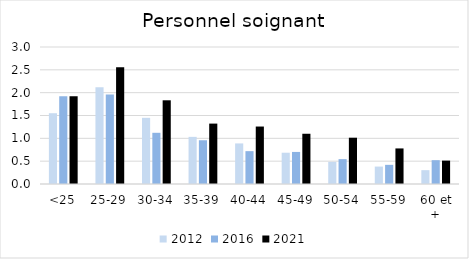
| Category | 2012 | 2016 | 2021 |
|---|---|---|---|
| <25 | 1.55 | 1.924 | 1.923 |
| 25-29 | 2.117 | 1.959 | 2.559 |
| 30-34 | 1.449 | 1.121 | 1.833 |
| 35-39 | 1.032 | 0.958 | 1.323 |
| 40-44 | 0.888 | 0.719 | 1.258 |
| 45-49 | 0.685 | 0.702 | 1.1 |
| 50-54 | 0.484 | 0.544 | 1.014 |
| 55-59 | 0.382 | 0.42 | 0.779 |
| 60 et + | 0.303 | 0.522 | 0.512 |